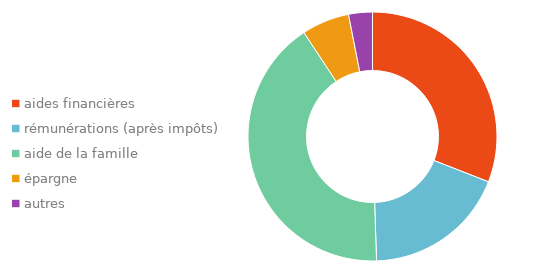
| Category | Series 0 |
|---|---|
| aides financières | 0.309 |
| rémunérations (après impôts) | 0.186 |
| aide de la famille | 0.412 |
| épargne | 0.062 |
| autres | 0.031 |